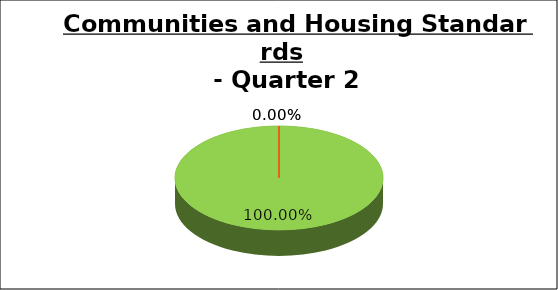
| Category | Q2 |
|---|---|
| Green | 1 |
| Amber | 0 |
| Red | 0 |